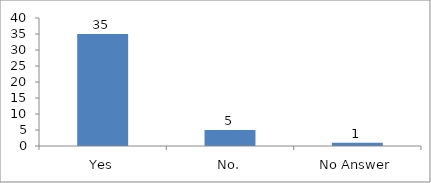
| Category | Would you like to recommend this session to your friend or colleague? |
|---|---|
| Yes | 35 |
| No. | 5 |
| No Answer | 1 |